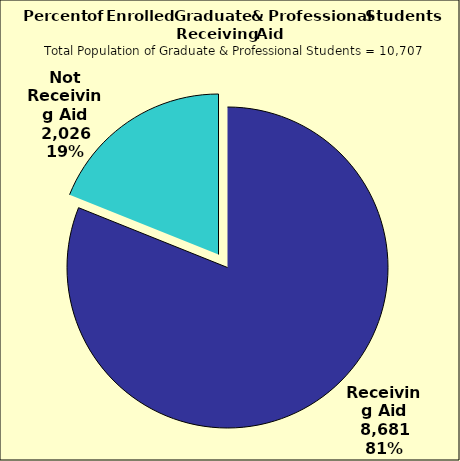
| Category | Series 0 |
|---|---|
| Receiving Aid | 8681 |
| Not Receiving Aid | 2026 |